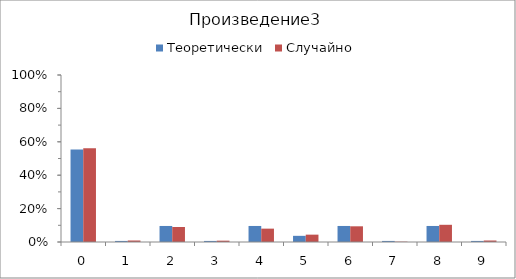
| Category | Теоретически | Случайно |
|---|---|---|
| 0.0 | 0.554 | 0.561 |
| 1.0 | 0.006 | 0.009 |
| 2.0 | 0.096 | 0.09 |
| 3.0 | 0.006 | 0.008 |
| 4.0 | 0.096 | 0.08 |
| 5.0 | 0.037 | 0.044 |
| 6.0 | 0.096 | 0.094 |
| 7.0 | 0.006 | 0.002 |
| 8.0 | 0.096 | 0.103 |
| 9.0 | 0.006 | 0.009 |